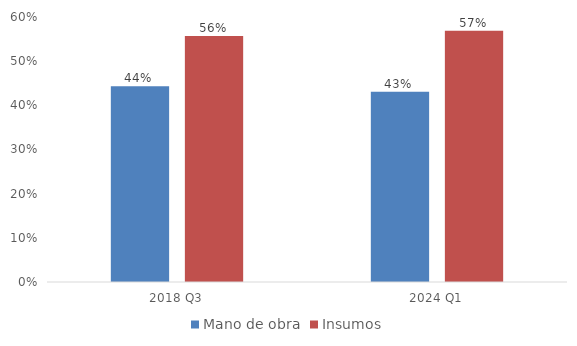
| Category | Mano de obra | Insumos |
|---|---|---|
| 2018 Q3 | 0.443 | 0.557 |
| 2024 Q1 | 0.431 | 0.569 |